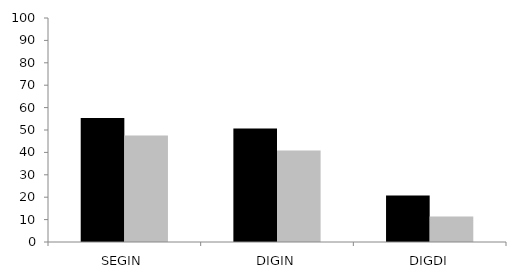
| Category | grupo control | grupo TEL |
|---|---|---|
| SEGIN | 55.333 | 47.556 |
| DIGIN | 50.625 | 40.833 |
| DIGDI | 20.714 | 11.429 |